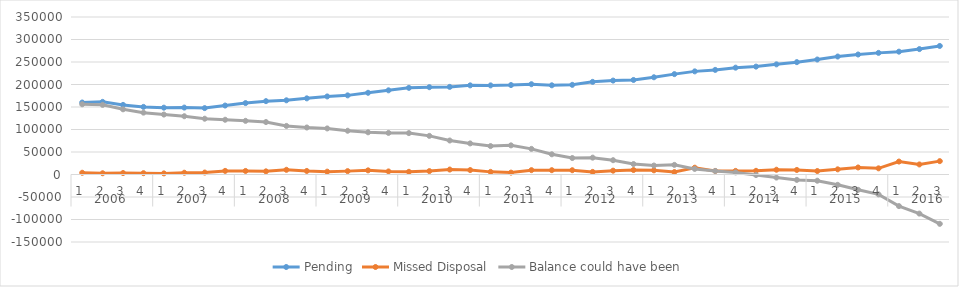
| Category | Pending | Missed Disposal | Balance could have been |
|---|---|---|---|
| 0 | 159976 | 3868.129 | 156107.871 |
| 1 | 161396 | 2745.312 | 154782.558 |
| 2 | 154692 | 3236.618 | 144841.941 |
| 3 | 150263 | 2938.235 | 137473.706 |
| 4 | 148512 | 2496.471 | 133226.235 |
| 5 | 148712 | 3939.355 | 129486.88 |
| 6 | 147537 | 4330.581 | 123981.299 |
| 7 | 153247 | 8014.833 | 121676.466 |
| 8 | 158692 | 7875.5 | 119245.966 |
| 9 | 163002 | 7002.069 | 116553.897 |
| 10 | 164863 | 10465.833 | 107949.064 |
| 11 | 169214 | 7857.133 | 104442.93 |
| 12 | 173454 | 6336.581 | 102346.35 |
| 13 | 175846 | 7499.933 | 97238.417 |
| 14 | 181585 | 9213.103 | 93764.313 |
| 15 | 187050 | 6823.375 | 92405.938 |
| 16 | 192574 | 5964.875 | 91965.063 |
| 17 | 194000 | 7526.75 | 85864.313 |
| 18 | 194691 | 11009.032 | 75546.281 |
| 19 | 198084 | 9869.226 | 69070.055 |
| 20 | 198027 | 5842.378 | 63170.677 |
| 21 | 198757 | 4195.028 | 64748.649 |
| 22 | 200634 | 9695.03 | 56930.619 |
| 23 | 198214 | 9612.969 | 44897.65 |
| 24 | 199229 | 9520.531 | 36592.119 |
| 25 | 205868 | 5774.545 | 37456.573 |
| 26 | 208700 | 8503.273 | 31785.3 |
| 27 | 210101 | 9967.312 | 23218.988 |
| 28 | 216068 | 9285.517 | 19900.471 |
| 29 | 223067 | 5476.848 | 21422.622 |
| 30 | 229176 | 15116.16 | 12415.462 |
| 31 | 232459 | 7840.588 | 7857.874 |
| 32 | 237413 | 7984.485 | 4647.389 |
| 33 | 239745 | 8179.548 | -1200.159 |
| 34 | 244762 | 10604.903 | -6788.063 |
| 35 | 249701 | 10114.839 | -11963.901 |
| 36 | 255525 | 7674.483 | -13814.384 |
| 37 | 262148 | 11478.296 | -22960.68 |
| 38 | 266681 | 15642.815 | -34070.495 |
| 39 | 270272 | 13700.25 | -44179.745 |
| 40 | 272971 | 28775.52 | -70256.265 |
| 41 | 278695 | 22338.72 | -86870.985 |
| 42 | 285663 | 29724.261 | -109627.246 |